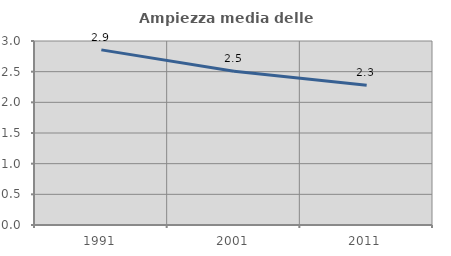
| Category | Ampiezza media delle famiglie |
|---|---|
| 1991.0 | 2.856 |
| 2001.0 | 2.507 |
| 2011.0 | 2.279 |